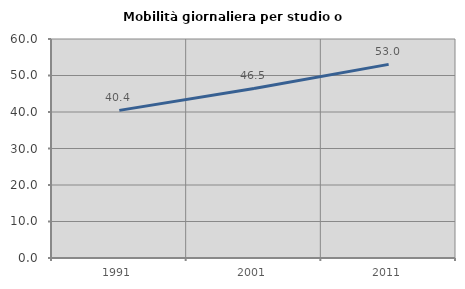
| Category | Mobilità giornaliera per studio o lavoro |
|---|---|
| 1991.0 | 40.441 |
| 2001.0 | 46.457 |
| 2011.0 | 53.049 |